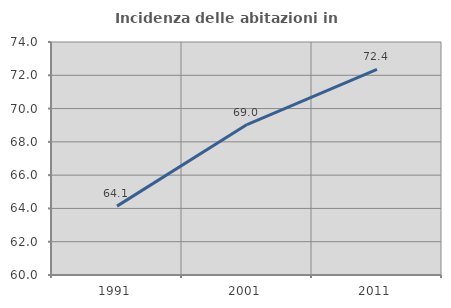
| Category | Incidenza delle abitazioni in proprietà  |
|---|---|
| 1991.0 | 64.138 |
| 2001.0 | 69.039 |
| 2011.0 | 72.358 |